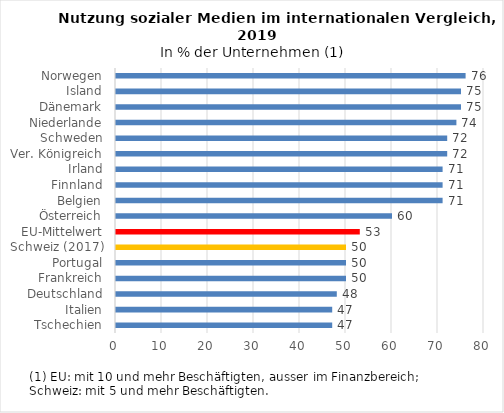
| Category | Series 0 |
|---|---|
| Tschechien | 47 |
| Italien | 47 |
| Deutschland | 48 |
| Frankreich | 50 |
| Portugal | 50 |
| Schweiz (2017) | 50 |
| EU-Mittelwert | 53 |
| Österreich | 60 |
| Belgien | 71 |
| Finnland | 71 |
| Irland | 71 |
| Ver. Königreich | 72 |
| Schweden | 72 |
| Niederlande | 74 |
| Dänemark | 75 |
| Island | 75 |
| Norwegen | 76 |